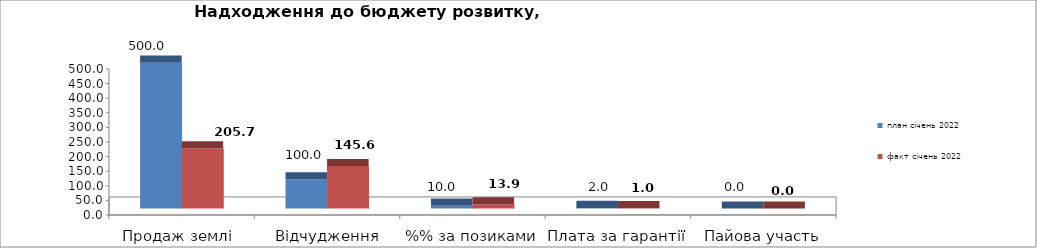
| Category | план січень 2022 | факт січень 2022 |
|---|---|---|
| Продаж землі  | 500 | 205.74 |
| Відчудження майна | 100 | 145.625 |
| %% за позиками | 10 | 13.94 |
| Плата за гарантії | 2 | 1 |
| Пайова участь | 0 | 0 |